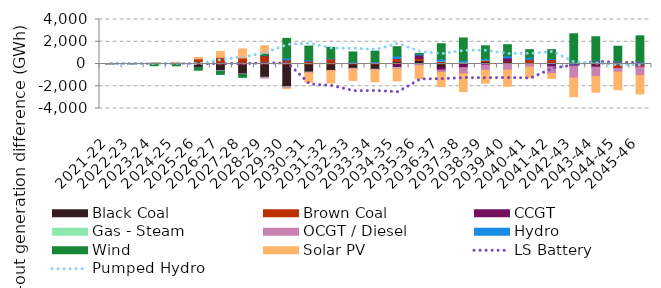
| Category | Black Coal | Brown Coal | CCGT | Gas - Steam | OCGT / Diesel | Hydro | Wind | Solar PV |
|---|---|---|---|---|---|---|---|---|
| 2021-22 | -0.157 | -0.049 | -0.001 | -0.001 | -0.007 | 0.012 | -0.027 | -5.016 |
| 2022-23 | -0.148 | -0.162 | -0.004 | 0 | -0.006 | 0.014 | -0.08 | -3.135 |
| 2023-24 | 14.551 | -5.243 | 0.013 | 0.089 | 0.053 | 8.196 | -147.607 | 116.343 |
| 2024-25 | 29.943 | -20.612 | -0.005 | 0.028 | 0.065 | 4.867 | -142.242 | 116.95 |
| 2025-26 | -331.987 | 462.284 | -0.006 | -1.645 | -0.529 | -9.015 | -214.21 | 128.326 |
| 2026-27 | -606.359 | 598.684 | -0.006 | -5.609 | -30.547 | -26.374 | -263.326 | 516.722 |
| 2027-28 | -901.795 | 543.549 | -12.167 | -3.581 | -33.273 | -6.771 | -244.368 | 806.772 |
| 2028-29 | -1194.083 | 726.813 | 25.714 | -27.334 | -39.539 | 30.19 | 176.62 | 685.894 |
| 2029-30 | -2043.07 | 370.879 | 0.304 | -45.709 | -82.719 | 170.377 | 1759.165 | -34.177 |
| 2030-31 | -731.362 | 270.454 | 0.101 | -25.322 | -52.907 | 87.364 | 1254.715 | -839.221 |
| 2031-32 | -577.371 | 450.645 | -0.006 | -10.682 | -24.638 | 70.899 | 974.271 | -1090.607 |
| 2032-33 | -390.511 | 96.05 | -0.69 | -5.546 | -53.269 | 83.275 | 905.7 | -1025.662 |
| 2033-34 | -478.922 | 92.62 | -1.333 | -7.689 | -35.977 | 125.276 | 939.222 | -1075.227 |
| 2034-35 | 189.136 | 303.997 | -317.616 | -60.678 | -80.119 | 220.183 | 845.092 | -1058.978 |
| 2035-36 | 317.525 | 187.692 | 304.234 | -4.673 | -159.848 | 94.519 | 46.547 | -1158.463 |
| 2036-37 | -322.584 | 223.125 | -228.954 | 33.758 | -217.606 | 208.307 | 1355.037 | -1261.075 |
| 2037-38 | 10.059 | 153.895 | -327.994 | 15.631 | -568.03 | 137.323 | 2023.901 | -1590.139 |
| 2038-39 | 204.569 | 146.269 | -89.413 | 22.899 | -471.163 | 125.739 | 1141.351 | -1159.415 |
| 2039-40 | 186.831 | 67.391 | 299.02 | 0 | -547.022 | 180.145 | 1000.814 | -1454.453 |
| 2040-41 | 121.346 | 294.816 | 7.49 | 0 | -283.609 | 184.73 | 679.107 | -964.566 |
| 2041-42 | 120.542 | 286.928 | -259.017 | 0 | -612.975 | 80.442 | 803.051 | -431.147 |
| 2042-43 | -128.623 | -54.662 | -10.684 | 0 | -1063.741 | 173.842 | 2542.641 | -1674.99 |
| 2043-44 | -97.061 | 47.873 | -190.276 | 0 | -832.986 | 111.741 | 2290.315 | -1414.219 |
| 2044-45 | -51.675 | -333.243 | -9.373 | 0 | -333.188 | 54.302 | 1542.265 | -1588.802 |
| 2045-46 | -76.545 | -184.716 | -19.692 | 0 | -752.56 | 174.516 | 2357.786 | -1651.527 |